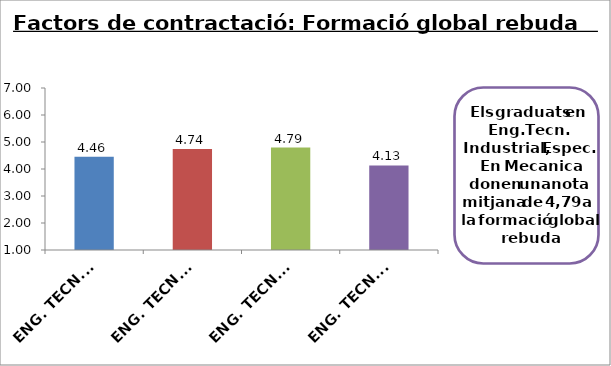
| Category | Series 0 |
|---|---|
| ENG. TECN. INDUSTRIAL, ESPEC. EN ELECTRICITAT | 4.457 |
| ENG. TECN. INDUSTRIAL, ESPEC. EN ELECTRONICA INDUSTRIAL | 4.745 |
| ENG. TECN. INDUSTRIAL, ESPEC. EN MECANICA | 4.794 |
| ENG. TECN. INDUSTRIAL, ESPEC. EN QUÍMICA INDUSTRIAL | 4.133 |